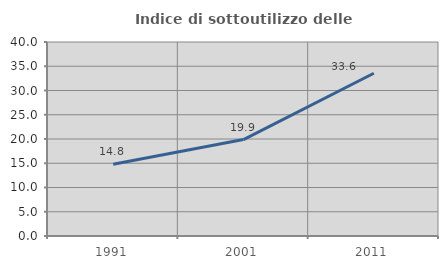
| Category | Indice di sottoutilizzo delle abitazioni  |
|---|---|
| 1991.0 | 14.805 |
| 2001.0 | 19.886 |
| 2011.0 | 33.553 |